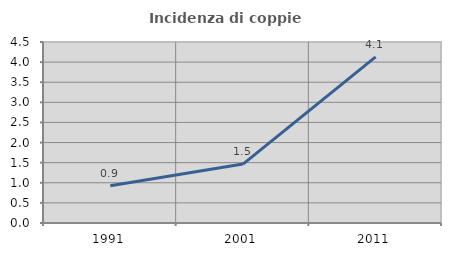
| Category | Incidenza di coppie miste |
|---|---|
| 1991.0 | 0.926 |
| 2001.0 | 1.465 |
| 2011.0 | 4.132 |